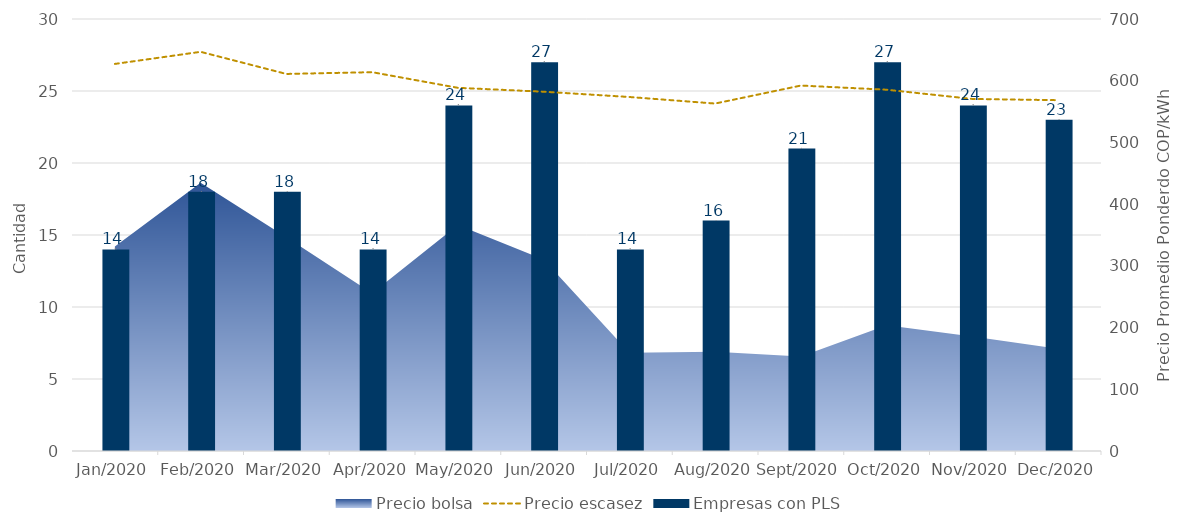
| Category | Empresas con PLS |
|---|---|
| 2020-01-01 | 14 |
| 2020-02-01 | 18 |
| 2020-03-01 | 18 |
| 2020-04-01 | 14 |
| 2020-05-01 | 24 |
| 2020-06-01 | 27 |
| 2020-07-01 | 14 |
| 2020-08-01 | 16 |
| 2020-09-01 | 21 |
| 2020-10-01 | 27 |
| 2020-11-01 | 24 |
| 2020-12-01 | 23 |